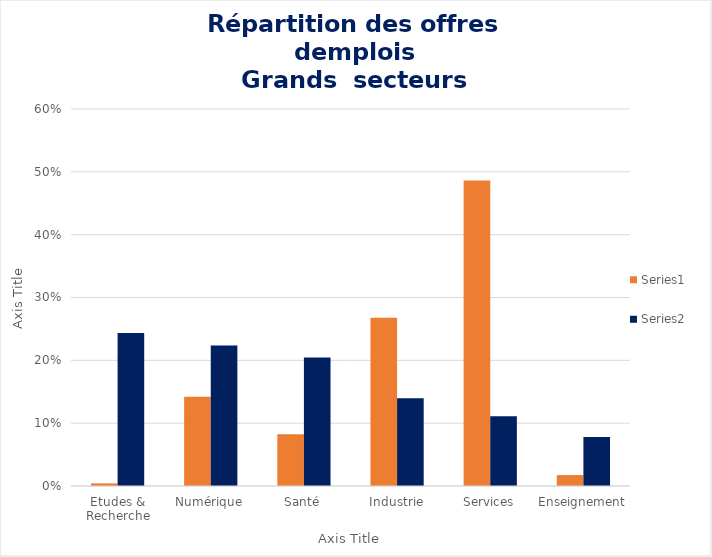
| Category | Series 0 | Series 1 |
|---|---|---|
| Etudes & Recherche | 0.004 | 0.243 |
| ​Numérique | 0.142 | 0.224 |
| Santé | 0.082 | 0.204 |
| Industrie | 0.268 | 0.139 |
| Services | 0.486 | 0.111 |
| Enseignement | 0.017 | 0.078 |